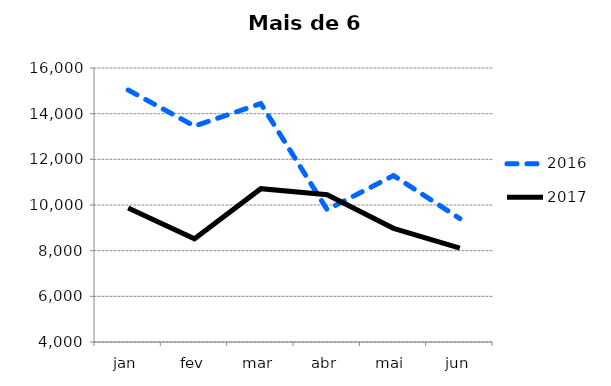
| Category | 2016 | 2017 |
|---|---|---|
| jan | 15037 | 9871 |
| fev | 13456 | 8517 |
| mar | 14442 | 10714 |
| abr | 9795 | 10447 |
| mai | 11288 | 8979 |
| jun | 9405 | 8108 |